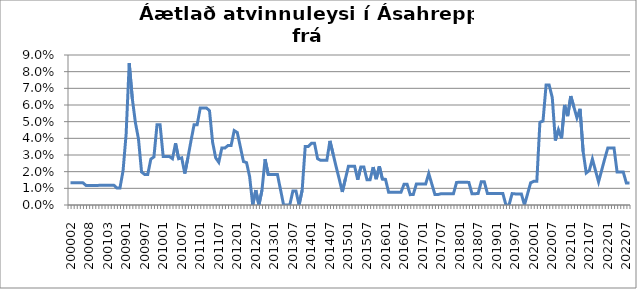
| Category | Series 0 |
|---|---|
| 200002 | 0.013 |
| 200003 | 0.013 |
| 200004 | 0.013 |
| 200005 | 0.013 |
| 200006 | 0.013 |
| 200007 | 0.012 |
| 200008 | 0.012 |
| 200010 | 0.012 |
| 200011 | 0.012 |
| 200012 | 0.012 |
| 200101 | 0.012 |
| 200102 | 0.012 |
| 200103 | 0.012 |
| 200104 | 0.012 |
| 200105 | 0.012 |
| 200810 | 0.01 |
| 200811 | 0.01 |
| 200812 | 0.02 |
| 200901 | 0.043 |
| 200902 | 0.085 |
| 200903 | 0.064 |
| 200904 | 0.05 |
| 200905 | 0.04 |
| 200906 | 0.02 |
| 200907 | 0.018 |
| 200908 | 0.018 |
| 200909 | 0.028 |
| 200910 | 0.029 |
| 200911 | 0.048 |
| 200912 | 0.048 |
| 201001 | 0.029 |
| 201002 | 0.029 |
| 201003 | 0.029 |
| 201004 | 0.028 |
| 201005 | 0.037 |
| 201006 | 0.028 |
| 201007 | 0.028 |
| 201008 | 0.019 |
| 201009 | 0.028 |
| 201010 | 0.038 |
| 201011 | 0.048 |
| 201012 | 0.048 |
| 201101 | 0.058 |
| 201102 | 0.058 |
| 201103 | 0.058 |
| 201104 | 0.057 |
| 201105 | 0.038 |
| 201106 | 0.028 |
| 201107 | 0.026 |
| 201108 | 0.034 |
| 201109 | 0.034 |
| 201110 | 0.036 |
| 201111 | 0.036 |
| 201112 | 0.045 |
| 201201 | 0.043 |
| 201202 | 0.035 |
| 201203 | 0.026 |
| 201204 | 0.025 |
| 201205 | 0.017 |
| 201206 | 0 |
| 201207 | 0.009 |
| 201208 | 0 |
| 201209 | 0.009 |
| 201210 | 0.028 |
| 201211 | 0.018 |
| 201212 | 0.018 |
| 201301 | 0.018 |
| 201302 | 0.018 |
| 201303 | 0.009 |
| 201304 | 0 |
| 201305 | 0 |
| 201306 | 0 |
| 201307 | 0.008 |
| 201308 | 0.008 |
| 201309 | 0 |
| 201310 | 0.009 |
| 201311 | 0.035 |
| 201312 | 0.035 |
| 201401 | 0.037 |
| 201402 | 0.037 |
| 201403 | 0.028 |
| 201404 | 0.027 |
| 201405 | 0.027 |
| 201406 | 0.027 |
| 201407 | 0.038 |
| 201408 | 0.031 |
| 201409 | 0.023 |
| 201410 | 0.016 |
| 201411 | 0.008 |
| 201412 | 0.016 |
| 201501 | 0.023 |
| 201502 | 0.023 |
| 201503 | 0.023 |
| 201504 | 0.015 |
| 201505 | 0.023 |
| 201506 | 0.023 |
| 201507 | 0.015 |
| 201508 | 0.015 |
| 201509 | 0.023 |
| 201510 | 0.016 |
| 201511 | 0.023 |
| 201512 | 0.016 |
| 201601 | 0.015 |
| 201602 | 0.008 |
| 201603 | 0.008 |
| 201604 | 0.008 |
| 201605 | 0.008 |
| 201606 | 0.008 |
| 201607 | 0.012 |
| 201608 | 0.012 |
| 201609 | 0.006 |
| 201610 | 0.006 |
| 201611 | 0.013 |
| 201612 | 0.013 |
| 201701 | 0.013 |
| 201702 | 0.013 |
| 201703 | 0.019 |
| 201704 | 0.013 |
| 201705 | 0.006 |
| 201706 | 0.006 |
| 201707 | 0.007 |
| 201708 | 0.007 |
| 201709 | 0.007 |
| 201710 | 0.007 |
| 201711 | 0.007 |
| 201712 | 0.014 |
| 201801 | 0.014 |
| 201802 | 0.014 |
| 201803 | 0.014 |
| 201804 | 0.014 |
| 201805 | 0.007 |
| 201806 | 0.007 |
| 201807 | 0.007 |
| 201808 | 0.014 |
| 201809 | 0.014 |
| 201810 | 0.007 |
| 201811 | 0.007 |
| 201812 | 0.007 |
| 201901 | 0.007 |
| 201902 | 0.007 |
| 201903 | 0.007 |
| 201904 | 0 |
| 201905 | 0 |
| 201906 | 0.007 |
| 201907 | 0.007 |
| 201908 | 0.007 |
| 201909 | 0.007 |
| 201910 | 0 |
| 201911 | 0.007 |
| 201912 | 0.013 |
| 202001 | 0.014 |
| 202002 | 0.014 |
| 202003 | 0.05 |
| 202004 | 0.05 |
| 202005 | 0.072 |
| 202006 | 0.072 |
| 202007 | 0.065 |
| 202008 | 0.039 |
| 202009 | 0.045 |
| 202010 | 0.04 |
| 202011 | 0.06 |
| 202012 | 0.053 |
| 202101 | 0.065 |
| 202102 | 0.059 |
| 202103 | 0.052 |
| 202104 | 0.058 |
| 202105 | 0.032 |
| 202106 | 0.019 |
| 202107 | 0.021 |
| 202108 | 0.028 |
| 202109 | 0.021 |
| 202110 | 0.014 |
| 202111 | 0.021 |
| 202112 | 0.028 |
| 202201 | 0.034 |
| 202202 | 0.034 |
| 202203 | 0.034 |
| 202204 | 0.02 |
| 202205 | 0.02 |
| 202206 | 0.02 |
| 202207 | 0.013 |
| 202208 | 0.013 |